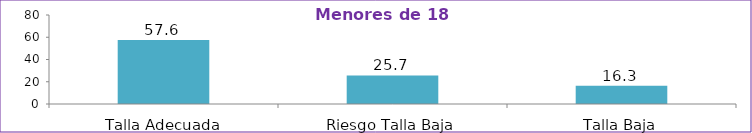
| Category | Series 0 |
|---|---|
| Talla Adecuada | 57.6 |
| Riesgo Talla Baja | 25.7 |
| Talla Baja | 16.3 |